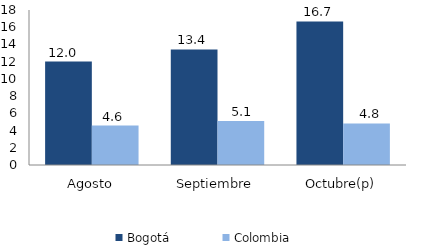
| Category | Bogotá | Colombia |
|---|---|---|
| Agosto | 12.012 | 4.586 |
| Septiembre | 13.416 | 5.101 |
| Octubre(p) | 16.667 | 4.821 |